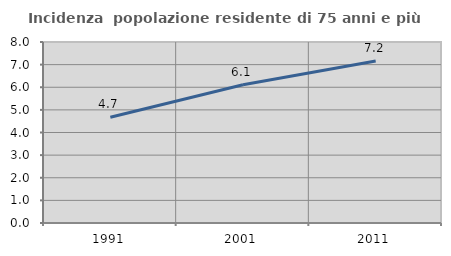
| Category | Incidenza  popolazione residente di 75 anni e più |
|---|---|
| 1991.0 | 4.675 |
| 2001.0 | 6.111 |
| 2011.0 | 7.162 |